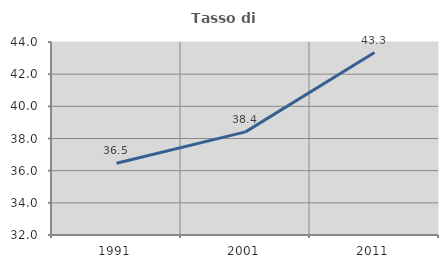
| Category | Tasso di occupazione   |
|---|---|
| 1991.0 | 36.461 |
| 2001.0 | 38.411 |
| 2011.0 | 43.346 |